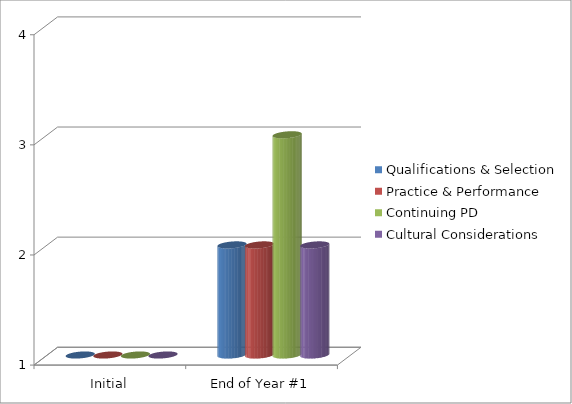
| Category | Qualifications & Selection  | Practice & Performance  | Continuing PD | Cultural Considerations  |
|---|---|---|---|---|
| Initial | 1 | 1 | 1 | 1 |
| End of Year #1 | 2 | 2 | 3 | 2 |